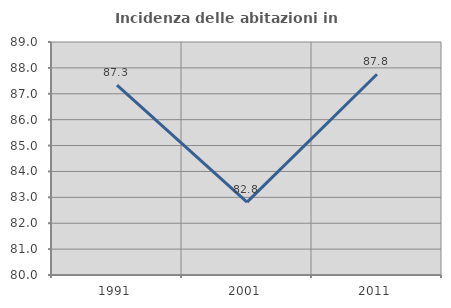
| Category | Incidenza delle abitazioni in proprietà  |
|---|---|
| 1991.0 | 87.335 |
| 2001.0 | 82.817 |
| 2011.0 | 87.755 |